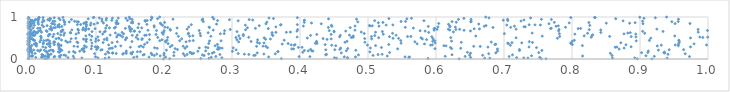
| Category | Series 0 |
|---|---|
| 0.1991780563574183 | 0.001 |
| 0.9175895030427509 | 0.002 |
| 0.6340036061331039 | 0.003 |
| 0.761816980917652 | 0.004 |
| 0.8960466204796318 | 0.005 |
| 0.7548996443671934 | 0.006 |
| 0.2083095177159592 | 0.007 |
| 0.025095795406379937 | 0.008 |
| 0.37260333437223 | 0.009 |
| 0.001016170793988963 | 0.01 |
| 0.2540848895981157 | 0.011 |
| 0.0286619644121203 | 0.012 |
| 0.0002508329451276316 | 0.013 |
| 0.5882363866009056 | 0.014 |
| 0.26612698161670495 | 0.015 |
| 0.0676181706408228 | 0.016 |
| 0.45369601675912985 | 0.017 |
| 0.11332073154871171 | 0.018 |
| 0.6715826714441548 | 0.019 |
| 0.6790725827601513 | 0.02 |
| 0.939909850203188 | 0.021 |
| 0.8594947820945181 | 0.022 |
| 0.7352153534726824 | 0.023 |
| 0.07919713996795337 | 0.024 |
| 0.47002047352051074 | 0.025 |
| 0.892290331578815 | 0.026 |
| 0.7291377228675502 | 0.027 |
| 0.10283778360322594 | 0.028 |
| 0.45070616213942005 | 0.029 |
| 0.28512642646373504 | 0.03 |
| 0.46986350790418985 | 0.031 |
| 0.7186795678471412 | 0.032 |
| 0.05874978134070909 | 0.033 |
| 0.1190552102812858 | 0.034 |
| 0.011413623234165648 | 0.035 |
| 0.6509054876752118 | 0.036 |
| 0.15557260223350164 | 0.037 |
| 0.7524874948113514 | 0.038 |
| 0.5599967475839281 | 0.039 |
| 0.26954061618664626 | 0.04 |
| 0.02140463027364743 | 0.041 |
| 0.019829318317294606 | 0.042 |
| 0.04683941420973955 | 0.043 |
| 0.20228488663993335 | 0.044 |
| 0.17797126212349623 | 0.045 |
| 0.030379421863730566 | 0.046 |
| 0.4816056757825863 | 0.047 |
| 0.03826115418434058 | 0.048 |
| 0.5609573615769984 | 0.049 |
| 0.3539245201934838 | 0.05 |
| 0.554481110029154 | 0.051 |
| 0.4650765241497945 | 0.052 |
| 0.02873325039815349 | 0.053 |
| 0.09920210955611644 | 0.054 |
| 0.16025982325530921 | 0.055 |
| 0.41455235285561554 | 0.056 |
| 0.3987179853430065 | 0.057 |
| 0.972766485182435 | 0.058 |
| 0.7075659279847808 | 0.059 |
| 0.03934609719234907 | 0.06 |
| 0.27626704126461216 | 0.061 |
| 0.642872276909152 | 0.062 |
| 0.9210851622673246 | 0.063 |
| 0.6135560661385766 | 0.064 |
| 0.005019848983053427 | 0.065 |
| 0.0022901772357769774 | 0.066 |
| 0.06651599044975151 | 0.067 |
| 0.04622469394833811 | 0.068 |
| 0.006183866947055935 | 0.069 |
| 0.5283017129789989 | 0.07 |
| 0.8155862320212903 | 0.071 |
| 0.02542595383428137 | 0.072 |
| 0.006052292913383103 | 0.073 |
| 0.19433328475012562 | 0.074 |
| 0.022723359693228952 | 0.075 |
| 0.7405336862554155 | 0.076 |
| 0.9087627386597692 | 0.077 |
| 0.23058951310884174 | 0.078 |
| 0.006728547116977158 | 0.079 |
| 0.2144357385578099 | 0.08 |
| 0.05547177308055582 | 0.081 |
| 0.1857524522246731 | 0.082 |
| 0.259028194279868 | 0.083 |
| 0.858911524558451 | 0.084 |
| 0.3320911753766322 | 0.085 |
| 0.5074361459082579 | 0.086 |
| 0.0311486370294893 | 0.087 |
| 0.021601941655811918 | 0.088 |
| 0.668649928402816 | 0.089 |
| 0.04844248498528764 | 0.09 |
| 0.33410641395634344 | 0.091 |
| 0.6494796227548147 | 0.092 |
| 0.021527053609773538 | 0.093 |
| 0.19982677229245907 | 0.094 |
| 0.1691792279513725 | 0.095 |
| 0.05287502159752699 | 0.096 |
| 0.48594408938721484 | 0.097 |
| 0.2565102575574487 | 0.098 |
| 0.7124787950544438 | 0.099 |
| 0.4377720460304379 | 0.1 |
| 0.6235460324411072 | 0.101 |
| 0.02956555597996534 | 0.102 |
| 0.18246486802462605 | 0.103 |
| 0.020264980519352785 | 0.104 |
| 0.5148235497746152 | 0.105 |
| 0.1708343321690925 | 0.106 |
| 0.28220501957897787 | 0.107 |
| 0.23402001616178653 | 0.108 |
| 0.32472375458055663 | 0.109 |
| 0.43902271712242386 | 0.11 |
| 0.9411503012015323 | 0.111 |
| 0.0011473757324300922 | 0.112 |
| 0.5207648175400791 | 0.113 |
| 0.13948562806324016 | 0.114 |
| 0.31814409364342533 | 0.115 |
| 0.11392153203799844 | 0.116 |
| 0.18937071704096448 | 0.117 |
| 0.033934869579417846 | 0.118 |
| 0.346894899820859 | 0.119 |
| 0.15252979744709985 | 0.12 |
| 0.2656089504911637 | 0.121 |
| 0.36359899726801315 | 0.122 |
| 0.24118503334138916 | 0.123 |
| 0.029354266038883813 | 0.124 |
| 0.966434182394307 | 0.125 |
| 0.677523634666355 | 0.126 |
| 0.22838465813873504 | 0.127 |
| 0.09787759988679995 | 0.128 |
| 0.14003545577221171 | 0.129 |
| 0.1296946853438715 | 0.13 |
| 0.3091243774707851 | 0.131 |
| 0.01037378709147283 | 0.132 |
| 0.14446340778390285 | 0.133 |
| 0.20020287416879298 | 0.134 |
| 0.8563799317949898 | 0.135 |
| 0.12422196537338577 | 0.136 |
| 0.18120349549274067 | 0.137 |
| 0.2434467909905104 | 0.138 |
| 0.6507866947338153 | 0.139 |
| 0.27091763346169867 | 0.14 |
| 0.15121682543130932 | 0.141 |
| 0.9364890339826893 | 0.142 |
| 0.00576554567811891 | 0.143 |
| 0.6879002490701251 | 0.144 |
| 0.46072631558785176 | 0.145 |
| 0.33713871269994844 | 0.146 |
| 0.11869065945182826 | 0.147 |
| 0.12473248889455427 | 0.148 |
| 0.9350821189473455 | 0.149 |
| 0.9023590791021702 | 0.15 |
| 0.2395692034408011 | 0.151 |
| 0.7511167210593763 | 0.152 |
| 0.14403816690169177 | 0.153 |
| 0.06920899132725918 | 0.154 |
| 0.5317873931834705 | 0.155 |
| 0.9115263460462636 | 0.156 |
| 0.23807296590333463 | 0.157 |
| 0.6462282748379831 | 0.158 |
| 0.2734547940828359 | 0.159 |
| 0.21468424113921936 | 0.16 |
| 0.40399697866286133 | 0.161 |
| 0.046618649178615294 | 0.162 |
| 0.0011679163756221386 | 0.163 |
| 0.1540000143529027 | 0.164 |
| 0.9359152173260101 | 0.165 |
| 0.06035932657927531 | 0.166 |
| 0.04466718402174137 | 0.167 |
| 0.027471495200396597 | 0.168 |
| 0.5027296743564197 | 0.169 |
| 0.0022398773222177064 | 0.17 |
| 0.11716053399189075 | 0.171 |
| 0.36723592832869567 | 0.172 |
| 0.16092869808806998 | 0.173 |
| 0.16528701465666046 | 0.174 |
| 0.08266791202055833 | 0.175 |
| 0.36773522544293585 | 0.176 |
| 0.004510273872340006 | 0.177 |
| 0.0668547119201629 | 0.178 |
| 0.026972436721410194 | 0.179 |
| 0.0051572526747207525 | 0.18 |
| 0.0004183127816852229 | 0.181 |
| 0.037198669598274975 | 0.182 |
| 0.3005972864511867 | 0.183 |
| 0.2497915999303502 | 0.184 |
| 0.0761427551312903 | 0.185 |
| 0.016948877649080697 | 0.186 |
| 0.6903999480339363 | 0.187 |
| 0.4189598684288815 | 0.188 |
| 0.9122442157049195 | 0.189 |
| 0.14462193602936557 | 0.19 |
| 0.08194186186851528 | 0.191 |
| 0.0018013310111392668 | 0.192 |
| 0.26134518590408573 | 0.193 |
| 0.41209774716933895 | 0.194 |
| 0.03095580626357338 | 0.195 |
| 0.4172843313469033 | 0.196 |
| 0.46819403953886973 | 0.197 |
| 0.004395563334372347 | 0.198 |
| 0.00013184207814802455 | 0.199 |
| 0.003444118455390034 | 0.2 |
| 0.7228264531525744 | 0.201 |
| 0.04784995112227507 | 0.202 |
| 0.4064550356401621 | 0.203 |
| 0.7557409605175703 | 0.204 |
| 0.014139516429230187 | 0.205 |
| 0.049803070877673515 | 0.206 |
| 0.48207750906796704 | 0.207 |
| 0.024138509332286825 | 0.208 |
| 0.03674644454562718 | 0.209 |
| 0.20358830587737525 | 0.21 |
| 0.10704125718712817 | 0.211 |
| 0.9271475575613594 | 0.212 |
| 0.033712753448169784 | 0.213 |
| 0.048493557845151046 | 0.214 |
| 0.008403484224938605 | 0.215 |
| 0.018838734893178055 | 0.216 |
| 0.3060651359158082 | 0.217 |
| 0.4379649248081997 | 0.218 |
| 0.9428986572983 | 0.219 |
| 0.0002642341379717757 | 0.22 |
| 0.4511900007464555 | 0.221 |
| 0.10888478694392197 | 0.222 |
| 0.9641989714088989 | 0.223 |
| 2.0170055655602002e-05 | 0.224 |
| 0.2198220748570151 | 0.225 |
| 0.7226376131869323 | 0.226 |
| 0.10099756499014562 | 0.227 |
| 0.07924883833894647 | 0.228 |
| 0.4585345081277291 | 0.229 |
| 0.41559107818354135 | 0.23 |
| 0.047766710606149024 | 0.231 |
| 0.2786248765257238 | 0.232 |
| 0.004233899645791117 | 0.233 |
| 0.04565686398248947 | 0.234 |
| 0.28074161646180545 | 0.235 |
| 0.8693253105964928 | 0.236 |
| 0.0034745897646080545 | 0.237 |
| 0.6903450659476795 | 0.238 |
| 0.0036444857899830987 | 0.239 |
| 0.38784339178225496 | 0.24 |
| 0.3905227050001859 | 0.241 |
| 0.5436029386038771 | 0.242 |
| 0.08046812490392273 | 0.243 |
| 0.09305876713310503 | 0.244 |
| 0.11940980801087532 | 0.245 |
| 0.5984683720240762 | 0.246 |
| 0.21637854246987534 | 0.247 |
| 0.6229742411621608 | 0.248 |
| 0.00047092592598478307 | 0.249 |
| 0.470222419560468 | 0.25 |
| 0.08237897768971918 | 0.251 |
| 0.0023087985293608468 | 0.252 |
| 0.0007692955791527368 | 0.253 |
| 0.2308291019918966 | 0.254 |
| 0.18997424065222804 | 0.255 |
| 0.6363196487762541 | 0.256 |
| 0.1219465661226694 | 0.257 |
| 0.12409287733464146 | 0.258 |
| 0.28538017748234934 | 0.259 |
| 0.4597249216466922 | 0.26 |
| 0.876615177016189 | 0.261 |
| 0.5034860468207023 | 0.262 |
| 0.2518563252091389 | 0.263 |
| 0.28213163123311596 | 0.264 |
| 0.30175110130340577 | 0.265 |
| 0.26467037493585366 | 0.266 |
| 0.0456944415934211 | 0.267 |
| 0.18620017917759946 | 0.268 |
| 0.10313910581790682 | 0.269 |
| 0.35219583230117174 | 0.27 |
| 0.7477675828407574 | 0.271 |
| 0.026007382379503785 | 0.272 |
| 0.10106091021628513 | 0.273 |
| 0.5197188352679298 | 0.274 |
| 0.6212672154246722 | 0.275 |
| 0.003947923771997352 | 0.276 |
| 0.3976757723973486 | 0.277 |
| 0.40300777947623356 | 0.278 |
| 0.15056321252544164 | 0.279 |
| 0.8635787058615051 | 0.28 |
| 0.2614285095230934 | 0.281 |
| 0.2795588380950516 | 0.282 |
| 0.6763812729524942 | 0.283 |
| 0.16943692155645687 | 0.284 |
| 0.8661200628783704 | 0.285 |
| 0.7367671876917632 | 0.286 |
| 0.08581222235369755 | 0.287 |
| 0.9742964459736326 | 0.288 |
| 0.02187072356560343 | 0.289 |
| 0.09892847457488899 | 0.29 |
| 0.8868832962175767 | 0.291 |
| 0.20922537721542747 | 0.292 |
| 0.1021989996596557 | 0.293 |
| 0.163486174058093 | 0.294 |
| 0.07298449093535651 | 0.295 |
| 0.23358789054638684 | 0.296 |
| 0.1285162542799065 | 0.297 |
| 0.031891598844162775 | 0.298 |
| 0.03224436622521933 | 0.299 |
| 0.6650388434817545 | 0.3 |
| 0.33612147805126763 | 0.301 |
| 0.655430306184681 | 0.302 |
| 0.34970506756080366 | 0.303 |
| 0.2282312767672222 | 0.304 |
| 0.06767812044061877 | 0.305 |
| 0.3456155059969204 | 0.306 |
| 0.0021210907439066003 | 0.307 |
| 0.09385545628863243 | 0.308 |
| 0.012485056047915034 | 0.309 |
| 0.9254220569833702 | 0.31 |
| 0.16627121982121426 | 0.311 |
| 0.13647807288500244 | 0.312 |
| 0.6148053351957011 | 0.313 |
| 0.2751092221299416 | 0.314 |
| 0.0829882855952994 | 0.315 |
| 0.45258163158899617 | 0.316 |
| 0.6117171185858828 | 0.317 |
| 0.9563827192217851 | 0.318 |
| 0.8152809869013464 | 0.319 |
| 0.5112117912459364 | 0.32 |
| 0.005383135928567413 | 0.321 |
| 0.2119470970470246 | 0.322 |
| 0.04444341458849017 | 0.323 |
| 0.048674004866730944 | 0.324 |
| 0.0465066522659556 | 0.325 |
| 0.7093605573948224 | 0.326 |
| 0.44662260431241746 | 0.327 |
| 0.39135119528263645 | 0.328 |
| 0.9313709740374826 | 0.329 |
| 0.5920772719785212 | 0.33 |
| 0.0013157395751765028 | 0.331 |
| 0.4991960195996361 | 0.332 |
| 0.9517851376292541 | 0.333 |
| 0.9979154064340038 | 0.334 |
| 0.11865835007628149 | 0.335 |
| 0.3869771621296877 | 0.336 |
| 0.5945647698704348 | 0.337 |
| 0.00021102045112437616 | 0.338 |
| 0.8793638784569203 | 0.339 |
| 0.011864805406189484 | 0.34 |
| 0.3927496704645534 | 0.341 |
| 0.4369578931896338 | 0.342 |
| 0.038686857903500994 | 0.343 |
| 0.8005145462573757 | 0.344 |
| 0.6866843815303688 | 0.345 |
| 0.5305012572297693 | 0.346 |
| 0.00047111651966850646 | 0.347 |
| 0.2786084604398101 | 0.348 |
| 0.1714441354930808 | 0.349 |
| 0.0001075514122421631 | 0.35 |
| 0.6879368393960504 | 0.351 |
| 0.009077283711299807 | 0.352 |
| 0.9564825501955752 | 0.353 |
| 0.02960146102727802 | 0.354 |
| 0.3738365182708363 | 0.355 |
| 2.9185347621679542e-05 | 0.356 |
| 0.02831909368523629 | 0.357 |
| 0.5830471979680975 | 0.358 |
| 0.010560286348126764 | 0.359 |
| 0.9794955865648707 | 0.36 |
| 0.5721970385194503 | 0.361 |
| 0.02249891285607693 | 0.362 |
| 0.04458618835678909 | 0.363 |
| 0.012683536229905382 | 0.364 |
| 0.20604794151032382 | 0.365 |
| 0.03269839347680214 | 0.366 |
| 0.7065825514013705 | 0.367 |
| 0.3824938203263367 | 0.368 |
| 0.7990310682504829 | 0.369 |
| 0.2657890983154152 | 0.37 |
| 0.4249603967321203 | 0.371 |
| 0.001892574128339397 | 0.372 |
| 0.03107454973345354 | 0.373 |
| 0.4226293779964186 | 0.374 |
| 0.3403674772398019 | 0.375 |
| 0.5486833037376656 | 0.376 |
| 0.7979606653994721 | 0.377 |
| 0.7055243222049243 | 0.378 |
| 0.011395283129914068 | 0.379 |
| 0.00013235325828551397 | 0.38 |
| 0.0939689181078401 | 0.381 |
| 0.3471140676681807 | 0.382 |
| 0.5986501502593091 | 0.383 |
| 0.7260992490371014 | 0.384 |
| 0.022486485339776423 | 0.385 |
| 0.8717932149445597 | 0.386 |
| 0.037745096799154325 | 0.387 |
| 0.07323888575945356 | 0.388 |
| 0.7117142715375587 | 0.389 |
| 0.12363231006828408 | 0.39 |
| 0.11043691752773946 | 0.391 |
| 0.17529452189671366 | 0.392 |
| 0.9576428076770367 | 0.393 |
| 0.7418378035581981 | 0.394 |
| 0.33716971125013956 | 0.395 |
| 0.6372311329994118 | 0.396 |
| 0.05819558394895966 | 0.397 |
| 0.4662252502972187 | 0.398 |
| 0.49542382561208165 | 0.399 |
| 0.0006954985571731745 | 0.4 |
| 0.42408664524633355 | 0.401 |
| 0.0394609254080646 | 0.402 |
| 0.6812841694495698 | 0.403 |
| 0.0720007845991629 | 0.404 |
| 0.2027003408589775 | 0.405 |
| 0.01746645982395726 | 0.406 |
| 0.3097930939238563 | 0.407 |
| 0.232505217412625 | 0.408 |
| 0.13127539954541415 | 0.409 |
| 0.5689166890223512 | 0.41 |
| 0.06192087494251592 | 0.411 |
| 0.03830249460340007 | 0.412 |
| 0.7371899657564344 | 0.413 |
| 1.6193428647212278e-05 | 0.414 |
| 0.08564607169772626 | 0.415 |
| 0.15287881292959438 | 0.416 |
| 0.0023160944212471464 | 0.417 |
| 0.3280469597617373 | 0.418 |
| 0.424320180880554 | 0.419 |
| 0.09951770536468804 | 0.42 |
| 0.8004909238525907 | 0.421 |
| 0.4692311133521115 | 0.422 |
| 0.5951638551277575 | 0.423 |
| 0.20215727319784974 | 0.424 |
| 0.9577111326249066 | 0.425 |
| 0.6228826929733023 | 0.426 |
| 0.0008702062071248911 | 0.427 |
| 0.05553692766888114 | 0.428 |
| 0.03176593289026011 | 0.429 |
| 0.2669778710946859 | 0.43 |
| 0.23760627163906475 | 0.431 |
| 0.8944780068183664 | 0.432 |
| 0.28391971617341977 | 0.433 |
| 0.19378371016079993 | 0.434 |
| 0.22300491619133608 | 0.435 |
| 0.5982662318774389 | 0.436 |
| 0.023115557388139633 | 0.437 |
| 0.5481796334609212 | 0.438 |
| 0.24302833834166035 | 0.439 |
| 1.830823010355904e-05 | 0.44 |
| 0.02673385867818445 | 0.441 |
| 0.9137668191375234 | 0.442 |
| 0.009816282304362727 | 0.443 |
| 0.10369859593620925 | 0.444 |
| 0.008699133007781391 | 0.445 |
| 0.8034678120237918 | 0.446 |
| 0.957021034832396 | 0.447 |
| 0.37676234499206396 | 0.448 |
| 0.01857858661378111 | 0.449 |
| 0.20465903120838824 | 0.45 |
| 0.04931721506366898 | 0.451 |
| 0.1162778167268881 | 0.452 |
| 0.09256589840033466 | 0.453 |
| 0.08484363076654339 | 0.454 |
| 0.02926627897874287 | 0.455 |
| 0.3072793511573281 | 0.456 |
| 0.3376715909590251 | 0.457 |
| 0.19708743411763557 | 0.458 |
| 0.1432439973826683 | 0.459 |
| 0.007937375885808113 | 0.46 |
| 0.5861494909276505 | 0.461 |
| 0.0015126468556047818 | 0.462 |
| 0.1786991936310651 | 0.463 |
| 0.16747737062617937 | 0.464 |
| 0.001606218513974846 | 0.465 |
| 0.11214909343950752 | 0.466 |
| 0.439797459095148 | 0.467 |
| 0.0014577870441031654 | 0.468 |
| 0.0015138701945996446 | 0.469 |
| 0.34939904320380877 | 0.47 |
| 0.08601403630350282 | 0.471 |
| 0.006580472076389854 | 0.472 |
| 0.16178068035357862 | 0.473 |
| 0.08163124871622064 | 0.474 |
| 0.003591909024848629 | 0.475 |
| 0.35645072484776713 | 0.476 |
| 0.5799385891892109 | 0.477 |
| 0.4458512706650219 | 0.478 |
| 0.505285134937185 | 0.479 |
| 0.09987871826252243 | 0.48 |
| 0.22594817140658366 | 0.481 |
| 0.06346678394356428 | 0.482 |
| 0.041378795738240076 | 0.483 |
| 0.5955223919109927 | 0.484 |
| 0.167990624419238 | 0.485 |
| 0.4951964635786382 | 0.486 |
| 0.4339987307730293 | 0.487 |
| 0.31177170894643835 | 0.488 |
| 0.144476829012572 | 0.489 |
| 0.5450036077554004 | 0.49 |
| 0.0457875418165145 | 0.491 |
| 0.0703284009280825 | 0.492 |
| 0.7786233354936365 | 0.493 |
| 0.5368308721643167 | 0.494 |
| 0.11591697348801798 | 0.495 |
| 0.9158232849763236 | 0.496 |
| 0.005058320636498281 | 0.497 |
| 0.045150901112196905 | 0.498 |
| 0.4107607389767092 | 0.499 |
| 0.9743275418876476 | 0.5 |
| 0.019433883939657334 | 0.501 |
| 0.00099647354805298 | 0.502 |
| 2.5441685577885833e-07 | 0.503 |
| 0.34731267516182146 | 0.504 |
| 0.7177991560070018 | 0.505 |
| 0.5779642570501149 | 0.506 |
| 0.5156112622325794 | 0.507 |
| 0.14488817321912392 | 0.508 |
| 0.6216808189733997 | 0.509 |
| 0.0023024166407504933 | 0.51 |
| 0.30584578092600084 | 0.511 |
| 0.4755134683738587 | 0.512 |
| 0.9924279009037649 | 0.513 |
| 0.19075761265532942 | 0.514 |
| 0.20533978850169843 | 0.515 |
| 0.1590806785741431 | 0.516 |
| 0.32459804989730695 | 0.517 |
| 0.8282569376214471 | 0.518 |
| 0.4766842451531824 | 0.519 |
| 0.999541490794446 | 0.52 |
| 0.4783247713544095 | 0.521 |
| 0.9880321578587999 | 0.522 |
| 0.39578204941363654 | 0.523 |
| 0.1305062087749395 | 0.524 |
| 0.8940973831832166 | 0.525 |
| 0.0191239755920224 | 0.526 |
| 0.10276008331754419 | 0.527 |
| 0.139063504709004 | 0.528 |
| 0.4582986044262186 | 0.529 |
| 0.5938859449589483 | 0.53 |
| 0.03664495591100342 | 0.531 |
| 0.5316554743434789 | 0.532 |
| 0.8871144026157219 | 0.533 |
| 0.5050746853838844 | 0.534 |
| 0.5582307562504062 | 0.535 |
| 0.5630461866377179 | 0.536 |
| 0.7819732294120659 | 0.537 |
| 0.8553845843662958 | 0.538 |
| 0.2211488010935816 | 0.539 |
| 0.09389587730250726 | 0.54 |
| 0.26889039491868094 | 0.541 |
| 0.23772500422746345 | 0.542 |
| 0.018768958382840036 | 0.543 |
| 0.7562757769149717 | 0.544 |
| 0.0029597317425544218 | 0.545 |
| 0.6584683161732665 | 0.546 |
| 0.47831980675260005 | 0.547 |
| 0.9511473446419515 | 0.548 |
| 0.0298791575945871 | 0.549 |
| 0.08508133891133901 | 0.55 |
| 0.8179402449131659 | 0.551 |
| 0.24251534324479188 | 0.552 |
| 0.3100806597395928 | 0.553 |
| 0.25385143747509714 | 0.554 |
| 0.008912049593158005 | 0.555 |
| 0.3166889482300989 | 0.556 |
| 0.35997859000490084 | 0.557 |
| 0.509888156750273 | 0.558 |
| 0.13598601531399623 | 0.559 |
| 0.8294811384865978 | 0.56 |
| 0.4156012435366056 | 0.561 |
| 0.45929120077080415 | 0.562 |
| 0.1715446856131435 | 0.563 |
| 0.15337957956030443 | 0.564 |
| 0.006278289893261137 | 0.565 |
| 0.05269141041023929 | 0.566 |
| 0.5412822161899578 | 0.567 |
| 0.17386549003311522 | 0.568 |
| 0.4726704857401848 | 0.569 |
| 0.16059015555214207 | 0.57 |
| 0.12081729923506287 | 0.571 |
| 0.1319839351365464 | 0.572 |
| 0.010344151742816847 | 0.573 |
| 0.048059509815705316 | 0.574 |
| 0.8304224594741664 | 0.575 |
| 4.220906231048497e-05 | 0.576 |
| 0.0062346588353133685 | 0.577 |
| 0.0904071172079234 | 0.578 |
| 0.13354311306030106 | 0.579 |
| 2.555583463283746e-05 | 0.58 |
| 0.17871702936461098 | 0.581 |
| 0.03082730932612546 | 0.582 |
| 0.31663041109864415 | 0.583 |
| 0.18830953233235442 | 0.584 |
| 0.42468966272048664 | 0.585 |
| 0.445822339169388 | 0.586 |
| 0.03227213061257454 | 0.587 |
| 0.03803298380324233 | 0.588 |
| 0.5224742621185299 | 0.589 |
| 0.35896545357605386 | 0.59 |
| 0.19870401813779492 | 0.591 |
| 0.8042439161564467 | 0.592 |
| 0.8938414210622262 | 0.593 |
| 0.07070160524863106 | 0.594 |
| 0.109825707046566 | 0.595 |
| 0.23545653513607362 | 0.596 |
| 0.006687599192896461 | 0.597 |
| 0.8764668937140278 | 0.598 |
| 0.14055998821645072 | 0.599 |
| 0.2828186786231687 | 0.6 |
| 0.0005598461441559079 | 0.601 |
| 0.00339471599141658 | 0.602 |
| 0.781459586332316 | 0.603 |
| 0.7005537755563189 | 0.604 |
| 0.2885395350201703 | 0.605 |
| 0.043808198964553 | 0.606 |
| 0.4945205862524741 | 0.607 |
| 0.21842144992924098 | 0.608 |
| 5.005212071526675e-05 | 0.609 |
| 0.2529900069722933 | 0.61 |
| 0.5361053636967656 | 0.611 |
| 0.8228821136777539 | 0.612 |
| 0.9069667927544903 | 0.613 |
| 0.23610149647069173 | 0.614 |
| 0.007305600796774602 | 0.615 |
| 0.053689709507302515 | 0.616 |
| 0.7414449538352221 | 0.617 |
| 0.8820500899443323 | 0.618 |
| 0.011959506964285205 | 0.619 |
| 0.006474523666972018 | 0.62 |
| 0.06278224773309347 | 0.621 |
| 0.1284280998349276 | 0.622 |
| 0.07444360148684177 | 0.623 |
| 0.1972558837339344 | 0.624 |
| 0.2648839364448669 | 0.625 |
| 0.013857788483184388 | 0.626 |
| 0.8856991413693686 | 0.627 |
| 0.3589853143920546 | 0.628 |
| 0.0018835458983953275 | 0.629 |
| 0.062202622109727025 | 0.63 |
| 0.8423983746605205 | 0.631 |
| 0.13842038961313882 | 0.632 |
| 0.5892803660848553 | 0.633 |
| 0.013621905251260533 | 0.634 |
| 0.3645771717752288 | 0.635 |
| 0.3799119271774654 | 0.636 |
| 0.019878123392037008 | 0.637 |
| 0.5110931441129765 | 0.638 |
| 0.9855813509483476 | 0.639 |
| 0.010391565639932168 | 0.64 |
| 0.3859075563809851 | 0.641 |
| 0.49002321276645866 | 0.642 |
| 0.19973212026462742 | 0.643 |
| 0.6256250337436473 | 0.644 |
| 0.11233677664860553 | 0.645 |
| 0.45008476393887226 | 0.646 |
| 0.04869914696745744 | 0.647 |
| 0.16409074474452093 | 0.648 |
| 0.10583979533172852 | 0.649 |
| 0.008947441653203955 | 0.65 |
| 0.30736397738887805 | 0.651 |
| 0.09421442223987132 | 0.652 |
| 0.5210908764008123 | 0.653 |
| 0.0032602620796002083 | 0.654 |
| 0.009294810629662021 | 0.655 |
| 0.027920703226115156 | 0.656 |
| 0.9338242019768455 | 0.657 |
| 0.9038505376632366 | 0.658 |
| 0.1510428299749903 | 0.659 |
| 0.11357754616996395 | 0.66 |
| 0.15610877348997967 | 0.661 |
| 0.4500599202455011 | 0.662 |
| 0.39555493565102207 | 0.663 |
| 0.5840397167869731 | 0.664 |
| 0.4672680177402623 | 0.665 |
| 0.15675731853241762 | 0.666 |
| 0.015889586488175123 | 0.667 |
| 0.6506815372737966 | 0.668 |
| 0.7802815258934606 | 0.669 |
| 0.05064413627308964 | 0.67 |
| 0.04915616529616991 | 0.671 |
| 0.20015089103105854 | 0.672 |
| 0.5766506938978021 | 0.673 |
| 0.02683732415253991 | 0.674 |
| 0.28908726915111677 | 0.675 |
| 0.44301971428473474 | 0.676 |
| 0.1890218962332658 | 0.677 |
| 0.25168874714214506 | 0.678 |
| 0.9992329833040732 | 0.679 |
| 0.08433714855287436 | 0.68 |
| 0.01831692389688044 | 0.681 |
| 0.07419249479102277 | 0.682 |
| 0.6412544001563536 | 0.683 |
| 0.17641678302032576 | 0.684 |
| 0.20930756562620922 | 0.685 |
| 0.5972121939355676 | 0.686 |
| 0.48084657929047775 | 0.687 |
| 0.27242862145075203 | 0.688 |
| 0.6204329408210145 | 0.689 |
| 0.034858075402382324 | 0.69 |
| 0.8422344098297629 | 0.691 |
| 0.06453067583229308 | 0.692 |
| 0.08435235937383115 | 0.693 |
| 0.051414784690804946 | 0.694 |
| 0.3198910823783614 | 0.695 |
| 0.08040368347960575 | 0.696 |
| 0.004733379241484616 | 0.697 |
| 0.1499568942236248 | 0.698 |
| 0.8253668898993823 | 0.699 |
| 0.39656755583112396 | 0.7 |
| 0.62924483477778 | 0.701 |
| 0.9854973809478349 | 0.702 |
| 0.7809909090467074 | 0.703 |
| 0.29742554878626515 | 0.704 |
| 0.2091121879806364 | 0.705 |
| 0.6016193751225768 | 0.706 |
| 0.6347769196202351 | 0.707 |
| 0.07342834270591556 | 0.708 |
| 0.618170278769573 | 0.709 |
| 0.7177955607679088 | 0.71 |
| 0.23394771680099188 | 0.711 |
| 0.9247491028920491 | 0.712 |
| 0.03188978858419841 | 0.713 |
| 0.08943256778654111 | 0.714 |
| 0.08553123111110773 | 0.715 |
| 0.6638585302885118 | 0.716 |
| 0.15248649254298172 | 0.717 |
| 0.0014774071317596208 | 0.718 |
| 0.656123827608029 | 0.719 |
| 0.5970433501725231 | 0.72 |
| 0.03440939649696386 | 0.721 |
| 0.09857399888708043 | 0.722 |
| 0.8091242432422489 | 0.723 |
| 0.3533745951233679 | 0.724 |
| 0.08537875082820329 | 0.725 |
| 0.001360320305179196 | 0.726 |
| 0.7684563362587751 | 0.727 |
| 0.8126696781088378 | 0.728 |
| 0.14313406375182192 | 0.729 |
| 0.33446526926218206 | 0.73 |
| 0.5981452069666278 | 0.731 |
| 0.014370083570323844 | 0.732 |
| 0.7694892560169138 | 0.733 |
| 0.0177595243810875 | 0.734 |
| 0.11416620341693139 | 0.735 |
| 0.5666878390017386 | 0.736 |
| 0.12714624615703393 | 0.737 |
| 0.08126778479609974 | 0.738 |
| 0.2192479294062328 | 0.739 |
| 0.16724265288469203 | 0.74 |
| 0.1197557080554343 | 0.741 |
| 0.007618410687968975 | 0.742 |
| 0.1493240234423406 | 0.743 |
| 0.3226870835258977 | 0.744 |
| 0.03798737405255319 | 0.745 |
| 0.16167804506726782 | 0.746 |
| 0.4739532948960363 | 0.747 |
| 0.04051850419975365 | 0.748 |
| 0.20536840468094295 | 0.749 |
| 0.6837707972678924 | 0.75 |
| 0.266965510915708 | 0.751 |
| 0.441732714730976 | 0.752 |
| 0.7097867069909738 | 0.753 |
| 0.5548425275823258 | 0.754 |
| 0.7905103615858021 | 0.755 |
| 0.12860174870424365 | 0.756 |
| 1.9493045218439495e-05 | 0.757 |
| 0.20136957113148565 | 0.758 |
| 0.26627849876119475 | 0.759 |
| 0.6284848081957463 | 0.76 |
| 0.04617310147031537 | 0.761 |
| 0.18555507913971783 | 0.762 |
| 0.23639349425286332 | 0.763 |
| 0.36451547757425695 | 0.764 |
| 0.602883832804757 | 0.765 |
| 0.7312418196252201 | 0.766 |
| 0.7294473407104666 | 0.767 |
| 0.022873723568852873 | 0.768 |
| 0.044281139203787644 | 0.769 |
| 0.6205218945015106 | 0.77 |
| 0.033577894368402195 | 0.771 |
| 0.0023754442590700115 | 0.772 |
| 0.0024769344047322534 | 0.773 |
| 0.14899530453470552 | 0.774 |
| 0.04981131089439793 | 0.775 |
| 0.5885868871187137 | 0.776 |
| 0.4469357353370208 | 0.777 |
| 0.003574073273359675 | 0.778 |
| 0.6710547004666394 | 0.779 |
| 0.7765182367274317 | 0.78 |
| 0.7153662157955384 | 0.781 |
| 0.5161103873724092 | 0.782 |
| 0.08581805961571976 | 0.783 |
| 0.40494757463962067 | 0.784 |
| 0.48094835540371467 | 0.785 |
| 0.6204393597855087 | 0.786 |
| 0.5028169933023275 | 0.787 |
| 0.0047909603055849995 | 0.788 |
| 0.779843782311625 | 0.789 |
| 0.506287019522416 | 0.79 |
| 0.18550606314642215 | 0.791 |
| 0.0004164959466770476 | 0.792 |
| 0.34009937037333254 | 0.793 |
| 0.028035997544241804 | 0.794 |
| 0.6735542078739347 | 0.795 |
| 0.00023250748937226438 | 0.796 |
| 0.11586108917030596 | 0.797 |
| 0.502132977516558 | 0.798 |
| 0.04410807167287275 | 0.799 |
| 0.8260966566848909 | 0.8 |
| 0.004211276203847311 | 0.801 |
| 0.19776431444207127 | 0.802 |
| 0.44619359955164833 | 0.803 |
| 0.009306503509893291 | 0.804 |
| 0.02085496123436559 | 0.805 |
| 0.31962143265597726 | 0.806 |
| 0.09189871045510782 | 0.807 |
| 0.5267126617680415 | 0.808 |
| 0.7041817318974509 | 0.809 |
| 0.7535259366310132 | 0.81 |
| 0.37148846739209485 | 0.811 |
| 0.5365618935810225 | 0.812 |
| 0.7455833698596805 | 0.813 |
| 0.003230535838057184 | 0.814 |
| 0.7369875559999093 | 0.815 |
| 0.37193966933834505 | 0.816 |
| 0.24017431912122864 | 0.817 |
| 0.0726030054180144 | 0.818 |
| 0.3960913413166305 | 0.819 |
| 0.08595369965601948 | 0.82 |
| 0.07743883930135216 | 0.821 |
| 0.03920459250361052 | 0.822 |
| 0.045963084313008544 | 0.823 |
| 0.17490112189961718 | 0.824 |
| 0.05394402992003304 | 0.825 |
| 0.6185072843935919 | 0.826 |
| 0.0027505319213266067 | 0.827 |
| 0.08549550521938751 | 0.828 |
| 0.09723491210087526 | 0.829 |
| 0.01535078825551558 | 0.83 |
| 0.2773128959555477 | 0.831 |
| 0.19555976129999164 | 0.832 |
| 0.6628772234374116 | 0.833 |
| 0.13030754966593397 | 0.834 |
| 0.0027991149657793793 | 0.835 |
| 0.16301743640553024 | 0.836 |
| 0.349925746603032 | 0.837 |
| 0.43121004082658215 | 0.838 |
| 0.766091699923639 | 0.839 |
| 0.9043939224875107 | 0.84 |
| 0.0038575610720014393 | 0.841 |
| 0.03653015284706566 | 0.842 |
| 0.9516619533447083 | 0.843 |
| 0.13235315298517153 | 0.844 |
| 0.9735558690503068 | 0.845 |
| 0.6039296078796713 | 0.846 |
| 0.03489042095649166 | 0.847 |
| 0.0014178068737712294 | 0.848 |
| 0.08198668744684312 | 0.849 |
| 0.00659683274577009 | 0.85 |
| 0.00016535137965008605 | 0.851 |
| 0.8847423651805777 | 0.852 |
| 0.8504193714192008 | 0.853 |
| 0.19459097605545522 | 0.854 |
| 0.09245089259908797 | 0.855 |
| 0.10235059533774714 | 0.856 |
| 0.41694680280391244 | 0.857 |
| 0.11096282224148113 | 0.858 |
| 0.7958457194211775 | 0.859 |
| 0.12938876915712214 | 0.86 |
| 0.00887965765285214 | 0.861 |
| 0.15386161463814146 | 0.862 |
| 0.515237378638106 | 0.863 |
| 0.8928249161041412 | 0.864 |
| 0.08394027049759092 | 0.865 |
| 0.1518863606361131 | 0.866 |
| 0.13076123726352132 | 0.867 |
| 0.014825369748081539 | 0.868 |
| 0.8248185138636542 | 0.869 |
| 0.20095142982991193 | 0.87 |
| 0.52196753162219 | 0.871 |
| 0.4062902838932855 | 0.872 |
| 0.7740157172534634 | 0.873 |
| 0.021007850787677498 | 0.874 |
| 0.05378475870270804 | 0.875 |
| 0.6298057560752052 | 0.876 |
| 0.08599118085521315 | 0.877 |
| 0.35137225609519074 | 0.878 |
| 0.0007863883836113445 | 0.879 |
| 0.002520360409124685 | 0.88 |
| 0.06063081412447801 | 0.881 |
| 0.0002870161482212847 | 0.882 |
| 0.0741575124978437 | 0.883 |
| 0.4850268465734473 | 0.884 |
| 0.6512029440384521 | 0.885 |
| 0.15377086210145965 | 0.886 |
| 0.053892333285579457 | 0.887 |
| 0.9468352558512286 | 0.888 |
| 0.0720684111307817 | 0.889 |
| 0.6235447767976431 | 0.89 |
| 0.9562831495221599 | 0.891 |
| 0.2578544489780623 | 0.892 |
| 0.5486530688210675 | 0.893 |
| 0.5551979312794567 | 0.894 |
| 0.6516814944937382 | 0.895 |
| 0.03944203617100364 | 0.896 |
| 0.06843485879999707 | 0.897 |
| 0.0048515387788167705 | 0.898 |
| 0.903828622024816 | 0.899 |
| 0.10888772438077517 | 0.9 |
| 0.1724615073082828 | 0.901 |
| 0.036853486296069965 | 0.902 |
| 0.008766144352718297 | 0.903 |
| 0.7249874427235303 | 0.904 |
| 0.02368144061602736 | 0.905 |
| 0.014988254105799511 | 0.906 |
| 0.17283171902664207 | 0.907 |
| 0.875133354651908 | 0.908 |
| 0.13053555864941535 | 0.909 |
| 0.3090752195975083 | 0.91 |
| 0.5822786883612163 | 0.911 |
| 0.17213709647811462 | 0.912 |
| 0.509785744839165 | 0.913 |
| 0.7055576020744471 | 0.914 |
| 0.2787885799494117 | 0.915 |
| 0.03170407323115605 | 0.916 |
| 0.17515513752656084 | 0.917 |
| 0.14622439521954297 | 0.918 |
| 0.006436727813017627 | 0.919 |
| 0.12322948768601505 | 0.92 |
| 0.4063459720508455 | 0.921 |
| 0.40646520718365897 | 0.922 |
| 0.052402939922854906 | 0.923 |
| 0.6989499183560951 | 0.924 |
| 0.022224732824804066 | 0.925 |
| 0.11494127299936654 | 0.926 |
| 0.25590161838771697 | 0.927 |
| 0.33048752793149894 | 0.928 |
| 0.003912644231957596 | 0.929 |
| 0.7293257673609967 | 0.93 |
| 0.18076723896799293 | 0.931 |
| 0.014508749811691429 | 0.932 |
| 0.010900302959996512 | 0.933 |
| 0.047172379089681034 | 0.934 |
| 0.029114658335910842 | 0.935 |
| 0.29623329718272995 | 0.936 |
| 0.015189272041305019 | 0.937 |
| 0.3252777438770074 | 0.938 |
| 0.011133834405790043 | 0.939 |
| 0.06396608633990547 | 0.94 |
| 0.7696936789784122 | 0.941 |
| 0.15311806140571516 | 0.942 |
| 0.6329757344289411 | 0.943 |
| 0.755026716408638 | 0.944 |
| 0.6515479961618238 | 0.945 |
| 0.7051828535527146 | 0.946 |
| 0.9565608505359576 | 0.947 |
| 0.2132402338767293 | 0.948 |
| 0.4831006832527637 | 0.949 |
| 0.10869988727419858 | 0.95 |
| 0.2569281419311319 | 0.951 |
| 0.27331467380875246 | 0.952 |
| 0.032058842523171656 | 0.953 |
| 0.00046257308692022767 | 0.954 |
| 0.44197785408035284 | 0.955 |
| 0.0885850620323337 | 0.956 |
| 0.557165414196303 | 0.957 |
| 0.14978032574742312 | 0.958 |
| 0.8643126513159342 | 0.959 |
| 0.19054860319892947 | 0.96 |
| 0.033223335198631486 | 0.961 |
| 0.5307654617469583 | 0.962 |
| 0.0001333352402989859 | 0.963 |
| 0.36095362954783533 | 0.964 |
| 0.032078598370353005 | 0.965 |
| 0.014860251564846822 | 0.966 |
| 0.11544280987789475 | 0.967 |
| 0.6410369489031257 | 0.968 |
| 0.5640043822755731 | 0.969 |
| 0.9059253516891513 | 0.97 |
| 0.045402752956357116 | 0.971 |
| 0.1438867524687078 | 0.972 |
| 0.1241390417521409 | 0.973 |
| 0.1327221207847207 | 0.974 |
| 0.35445687123972774 | 0.975 |
| 0.18235433762734274 | 0.976 |
| 0.7391049383885171 | 0.977 |
| 0.10499312816674575 | 0.978 |
| 0.6779240217625276 | 0.979 |
| 0.016430287995274847 | 0.98 |
| 0.0009641770023607923 | 0.981 |
| 0.9226073652718549 | 0.982 |
| 0.03860929966655538 | 0.983 |
| 0.39614577135513473 | 0.984 |
| 0.09604901421911059 | 0.985 |
| 0.022151778399212528 | 0.986 |
| 0.7981495608655226 | 0.987 |
| 0.8331989589230824 | 0.988 |
| 0.834059232577348 | 0.989 |
| 0.0005413147989323223 | 0.99 |
| 0.0514127726167995 | 0.991 |
| 0.09676261167101269 | 0.992 |
| 0.27150916119623747 | 0.993 |
| 0.016249915979319223 | 0.994 |
| 0.14908805212915596 | 0.995 |
| 0.899709143336712 | 0.996 |
| 0.18174053280928398 | 0.997 |
| 0.6731359876258788 | 0.998 |
| 0.9391178818920679 | 0.999 |
| 0.19365780002254387 | 1 |